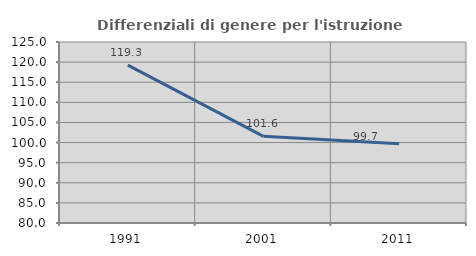
| Category | Differenziali di genere per l'istruzione superiore |
|---|---|
| 1991.0 | 119.252 |
| 2001.0 | 101.555 |
| 2011.0 | 99.696 |